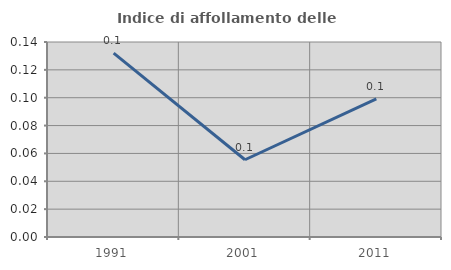
| Category | Indice di affollamento delle abitazioni  |
|---|---|
| 1991.0 | 0.132 |
| 2001.0 | 0.055 |
| 2011.0 | 0.099 |